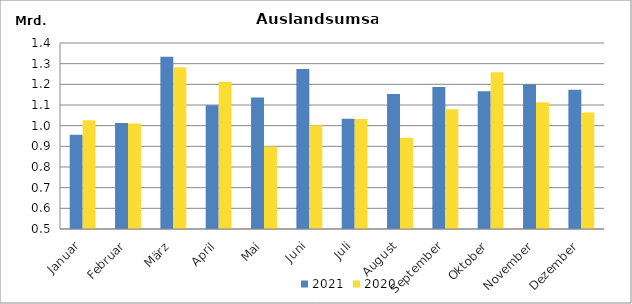
| Category | 2021 | 2020 |
|---|---|---|
| Januar | 955637.473 | 1025888.38 |
| Februar | 1013091.036 | 1010177.138 |
| März | 1333641.27 | 1283150.306 |
| April | 1098282.364 | 1212161.017 |
| Mai | 1135934.799 | 899000.171 |
| Juni | 1274348.633 | 1002279.679 |
| Juli | 1033642.04 | 1032456.246 |
| August | 1153311.063 | 941683.017 |
| September | 1187690.183 | 1079258.704 |
| Oktober | 1166203.554 | 1257952.564 |
| November | 1200022.105 | 1113506.029 |
| Dezember | 1173556.902 | 1063263.133 |